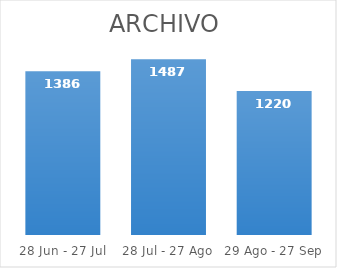
| Category | Series 0 |
|---|---|
| 28 Jun - 27 Jul | 1386 |
| 28 Jul - 27 Ago | 1487 |
| 29 Ago - 27 Sep | 1220 |